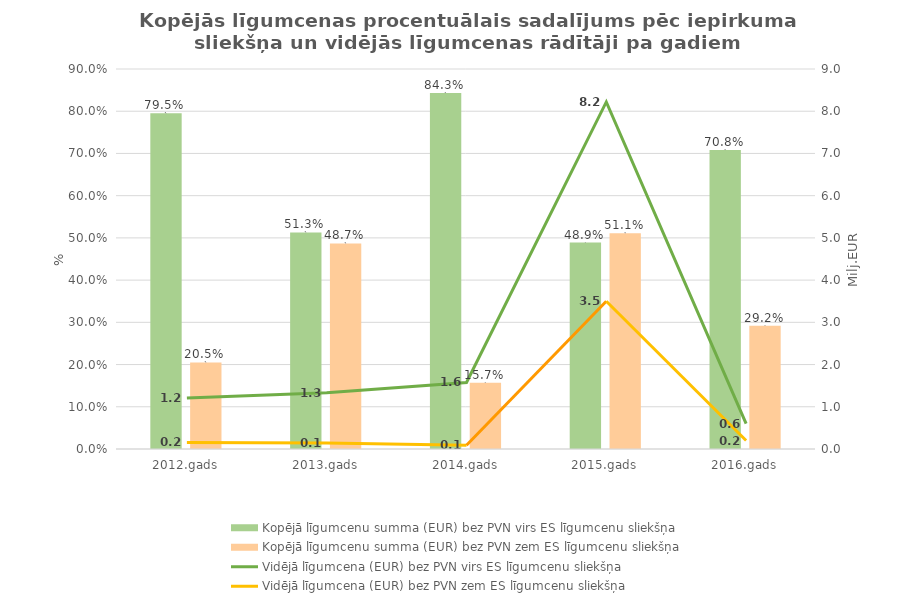
| Category | Kopējā līgumcenu summa (EUR) bez PVN |
|---|---|
| 2012.gads | 0.205 |
| 2013.gads | 0.487 |
| 2014.gads | 0.157 |
| 2015.gads | 0.511 |
| 2016.gads | 0.292 |